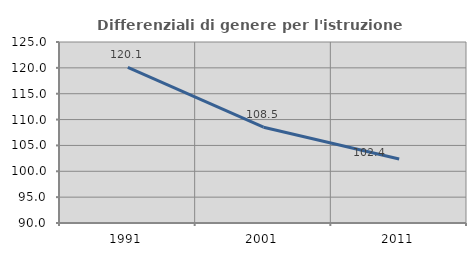
| Category | Differenziali di genere per l'istruzione superiore |
|---|---|
| 1991.0 | 120.074 |
| 2001.0 | 108.522 |
| 2011.0 | 102.363 |